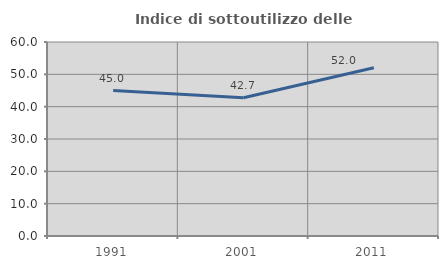
| Category | Indice di sottoutilizzo delle abitazioni  |
|---|---|
| 1991.0 | 44.97 |
| 2001.0 | 42.748 |
| 2011.0 | 52.03 |